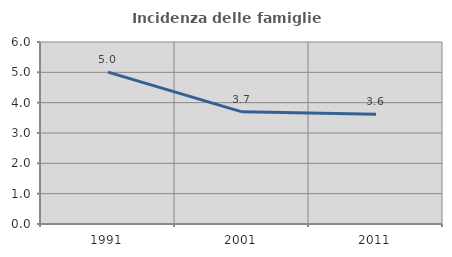
| Category | Incidenza delle famiglie numerose |
|---|---|
| 1991.0 | 5.005 |
| 2001.0 | 3.697 |
| 2011.0 | 3.614 |